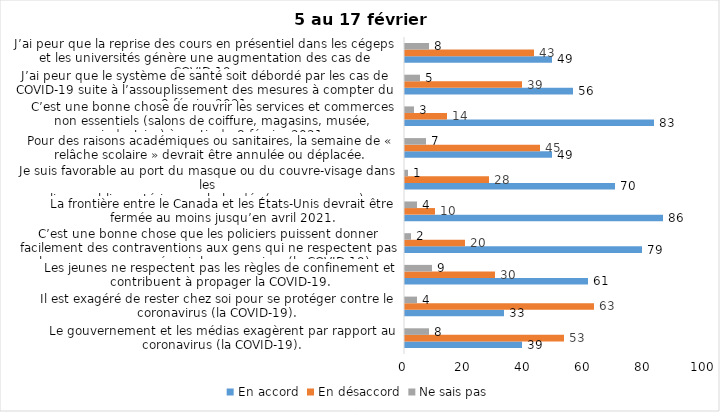
| Category | En accord | En désaccord | Ne sais pas |
|---|---|---|---|
| Le gouvernement et les médias exagèrent par rapport au coronavirus (la COVID-19). | 39 | 53 | 8 |
| Il est exagéré de rester chez soi pour se protéger contre le coronavirus (la COVID-19). | 33 | 63 | 4 |
| Les jeunes ne respectent pas les règles de confinement et contribuent à propager la COVID-19. | 61 | 30 | 9 |
| C’est une bonne chose que les policiers puissent donner facilement des contraventions aux gens qui ne respectent pas les mesures pour prévenir le coronavirus (la COVID-19). | 79 | 20 | 2 |
| La frontière entre le Canada et les États-Unis devrait être fermée au moins jusqu’en avril 2021. | 86 | 10 | 4 |
| Je suis favorable au port du masque ou du couvre-visage dans les
lieux publics extérieurs achalandés (ex. rues, parcs) | 70 | 28 | 1 |
| Pour des raisons académiques ou sanitaires, la semaine de « relâche scolaire » devrait être annulée ou déplacée. | 49 | 45 | 7 |
| C’est une bonne chose de rouvrir les services et commerces non essentiels (salons de coiffure, magasins, musée, industries) à partir du 8 février 2021. | 83 | 14 | 3 |
| J’ai peur que le système de santé soit débordé par les cas de COVID-19 suite à l’assouplissement des mesures à compter du 8 février 2021. | 56 | 39 | 5 |
| J’ai peur que la reprise des cours en présentiel dans les cégeps et les universités génère une augmentation des cas de COVID-19. | 49 | 43 | 8 |